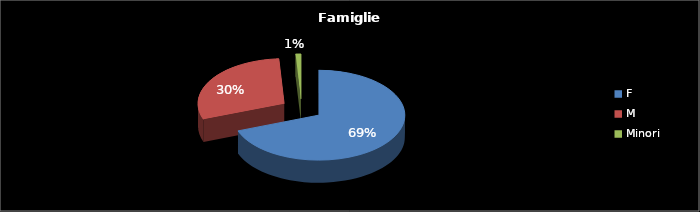
| Category | Series 0 |
|---|---|
| F | 70 |
| M | 30 |
| Minori | 1 |